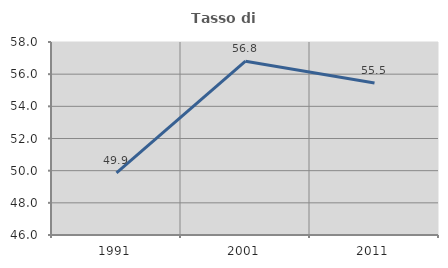
| Category | Tasso di occupazione   |
|---|---|
| 1991.0 | 49.86 |
| 2001.0 | 56.806 |
| 2011.0 | 55.455 |